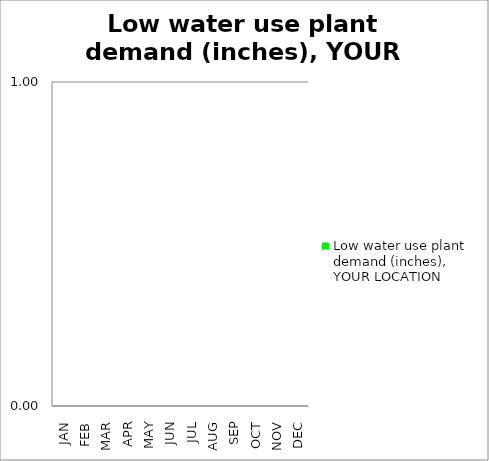
| Category | Low water use plant demand (inches), YOUR LOCATION |
|---|---|
| JAN | 0 |
| FEB | 0 |
| MAR | 0 |
| APR | 0 |
| MAY | 0 |
| JUN | 0 |
| JUL | 0 |
| AUG | 0 |
| SEP | 0 |
| OCT | 0 |
| NOV | 0 |
| DEC | 0 |